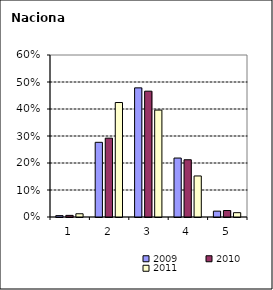
| Category | 2009 | 2010 | 2011 |
|---|---|---|---|
| 1.0 | 0.005 | 0.006 | 0.012 |
| 2.0 | 0.277 | 0.292 | 0.424 |
| 3.0 | 0.478 | 0.466 | 0.396 |
| 4.0 | 0.218 | 0.212 | 0.152 |
| 5.0 | 0.022 | 0.024 | 0.016 |